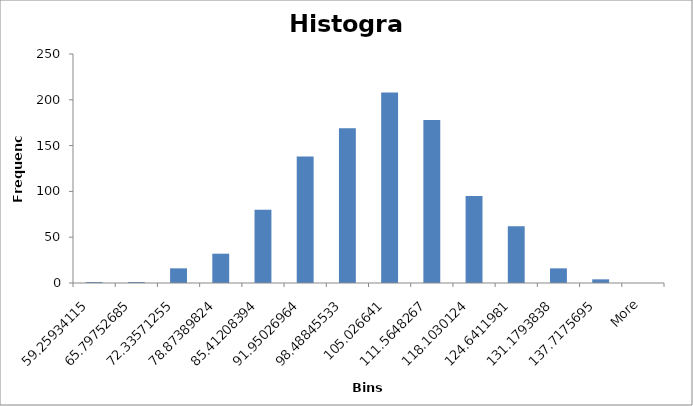
| Category | Frequency |
|---|---|
| 59.25934115 | 1 |
| 65.79752685 | 1 |
| 72.33571255 | 16 |
| 78.87389824 | 32 |
| 85.41208394 | 80 |
| 91.95026964 | 138 |
| 98.48845533 | 169 |
| 105.026641 | 208 |
| 111.5648267 | 178 |
| 118.1030124 | 95 |
| 124.6411981 | 62 |
| 131.1793838 | 16 |
| 137.7175695 | 4 |
| More | 0 |